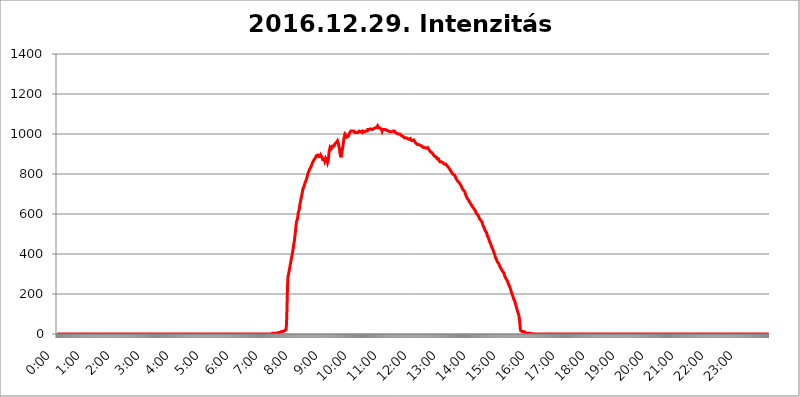
| Category | 2016.12.29. Intenzitás [W/m^2] |
|---|---|
| 0.0 | 0 |
| 0.0006944444444444445 | 0 |
| 0.001388888888888889 | 0 |
| 0.0020833333333333333 | 0 |
| 0.002777777777777778 | 0 |
| 0.003472222222222222 | 0 |
| 0.004166666666666667 | 0 |
| 0.004861111111111111 | 0 |
| 0.005555555555555556 | 0 |
| 0.0062499999999999995 | 0 |
| 0.006944444444444444 | 0 |
| 0.007638888888888889 | 0 |
| 0.008333333333333333 | 0 |
| 0.009027777777777779 | 0 |
| 0.009722222222222222 | 0 |
| 0.010416666666666666 | 0 |
| 0.011111111111111112 | 0 |
| 0.011805555555555555 | 0 |
| 0.012499999999999999 | 0 |
| 0.013194444444444444 | 0 |
| 0.013888888888888888 | 0 |
| 0.014583333333333332 | 0 |
| 0.015277777777777777 | 0 |
| 0.015972222222222224 | 0 |
| 0.016666666666666666 | 0 |
| 0.017361111111111112 | 0 |
| 0.018055555555555557 | 0 |
| 0.01875 | 0 |
| 0.019444444444444445 | 0 |
| 0.02013888888888889 | 0 |
| 0.020833333333333332 | 0 |
| 0.02152777777777778 | 0 |
| 0.022222222222222223 | 0 |
| 0.02291666666666667 | 0 |
| 0.02361111111111111 | 0 |
| 0.024305555555555556 | 0 |
| 0.024999999999999998 | 0 |
| 0.025694444444444447 | 0 |
| 0.02638888888888889 | 0 |
| 0.027083333333333334 | 0 |
| 0.027777777777777776 | 0 |
| 0.02847222222222222 | 0 |
| 0.029166666666666664 | 0 |
| 0.029861111111111113 | 0 |
| 0.030555555555555555 | 0 |
| 0.03125 | 0 |
| 0.03194444444444445 | 0 |
| 0.03263888888888889 | 0 |
| 0.03333333333333333 | 0 |
| 0.034027777777777775 | 0 |
| 0.034722222222222224 | 0 |
| 0.035416666666666666 | 0 |
| 0.036111111111111115 | 0 |
| 0.03680555555555556 | 0 |
| 0.0375 | 0 |
| 0.03819444444444444 | 0 |
| 0.03888888888888889 | 0 |
| 0.03958333333333333 | 0 |
| 0.04027777777777778 | 0 |
| 0.04097222222222222 | 0 |
| 0.041666666666666664 | 0 |
| 0.042361111111111106 | 0 |
| 0.04305555555555556 | 0 |
| 0.043750000000000004 | 0 |
| 0.044444444444444446 | 0 |
| 0.04513888888888889 | 0 |
| 0.04583333333333334 | 0 |
| 0.04652777777777778 | 0 |
| 0.04722222222222222 | 0 |
| 0.04791666666666666 | 0 |
| 0.04861111111111111 | 0 |
| 0.049305555555555554 | 0 |
| 0.049999999999999996 | 0 |
| 0.05069444444444445 | 0 |
| 0.051388888888888894 | 0 |
| 0.052083333333333336 | 0 |
| 0.05277777777777778 | 0 |
| 0.05347222222222222 | 0 |
| 0.05416666666666667 | 0 |
| 0.05486111111111111 | 0 |
| 0.05555555555555555 | 0 |
| 0.05625 | 0 |
| 0.05694444444444444 | 0 |
| 0.057638888888888885 | 0 |
| 0.05833333333333333 | 0 |
| 0.05902777777777778 | 0 |
| 0.059722222222222225 | 0 |
| 0.06041666666666667 | 0 |
| 0.061111111111111116 | 0 |
| 0.06180555555555556 | 0 |
| 0.0625 | 0 |
| 0.06319444444444444 | 0 |
| 0.06388888888888888 | 0 |
| 0.06458333333333334 | 0 |
| 0.06527777777777778 | 0 |
| 0.06597222222222222 | 0 |
| 0.06666666666666667 | 0 |
| 0.06736111111111111 | 0 |
| 0.06805555555555555 | 0 |
| 0.06874999999999999 | 0 |
| 0.06944444444444443 | 0 |
| 0.07013888888888889 | 0 |
| 0.07083333333333333 | 0 |
| 0.07152777777777779 | 0 |
| 0.07222222222222223 | 0 |
| 0.07291666666666667 | 0 |
| 0.07361111111111111 | 0 |
| 0.07430555555555556 | 0 |
| 0.075 | 0 |
| 0.07569444444444444 | 0 |
| 0.0763888888888889 | 0 |
| 0.07708333333333334 | 0 |
| 0.07777777777777778 | 0 |
| 0.07847222222222222 | 0 |
| 0.07916666666666666 | 0 |
| 0.0798611111111111 | 0 |
| 0.08055555555555556 | 0 |
| 0.08125 | 0 |
| 0.08194444444444444 | 0 |
| 0.08263888888888889 | 0 |
| 0.08333333333333333 | 0 |
| 0.08402777777777777 | 0 |
| 0.08472222222222221 | 0 |
| 0.08541666666666665 | 0 |
| 0.08611111111111112 | 0 |
| 0.08680555555555557 | 0 |
| 0.08750000000000001 | 0 |
| 0.08819444444444445 | 0 |
| 0.08888888888888889 | 0 |
| 0.08958333333333333 | 0 |
| 0.09027777777777778 | 0 |
| 0.09097222222222222 | 0 |
| 0.09166666666666667 | 0 |
| 0.09236111111111112 | 0 |
| 0.09305555555555556 | 0 |
| 0.09375 | 0 |
| 0.09444444444444444 | 0 |
| 0.09513888888888888 | 0 |
| 0.09583333333333333 | 0 |
| 0.09652777777777777 | 0 |
| 0.09722222222222222 | 0 |
| 0.09791666666666667 | 0 |
| 0.09861111111111111 | 0 |
| 0.09930555555555555 | 0 |
| 0.09999999999999999 | 0 |
| 0.10069444444444443 | 0 |
| 0.1013888888888889 | 0 |
| 0.10208333333333335 | 0 |
| 0.10277777777777779 | 0 |
| 0.10347222222222223 | 0 |
| 0.10416666666666667 | 0 |
| 0.10486111111111111 | 0 |
| 0.10555555555555556 | 0 |
| 0.10625 | 0 |
| 0.10694444444444444 | 0 |
| 0.1076388888888889 | 0 |
| 0.10833333333333334 | 0 |
| 0.10902777777777778 | 0 |
| 0.10972222222222222 | 0 |
| 0.1111111111111111 | 0 |
| 0.11180555555555556 | 0 |
| 0.11180555555555556 | 0 |
| 0.1125 | 0 |
| 0.11319444444444444 | 0 |
| 0.11388888888888889 | 0 |
| 0.11458333333333333 | 0 |
| 0.11527777777777777 | 0 |
| 0.11597222222222221 | 0 |
| 0.11666666666666665 | 0 |
| 0.1173611111111111 | 0 |
| 0.11805555555555557 | 0 |
| 0.11944444444444445 | 0 |
| 0.12013888888888889 | 0 |
| 0.12083333333333333 | 0 |
| 0.12152777777777778 | 0 |
| 0.12222222222222223 | 0 |
| 0.12291666666666667 | 0 |
| 0.12291666666666667 | 0 |
| 0.12361111111111112 | 0 |
| 0.12430555555555556 | 0 |
| 0.125 | 0 |
| 0.12569444444444444 | 0 |
| 0.12638888888888888 | 0 |
| 0.12708333333333333 | 0 |
| 0.16875 | 0 |
| 0.12847222222222224 | 0 |
| 0.12916666666666668 | 0 |
| 0.12986111111111112 | 0 |
| 0.13055555555555556 | 0 |
| 0.13125 | 0 |
| 0.13194444444444445 | 0 |
| 0.1326388888888889 | 0 |
| 0.13333333333333333 | 0 |
| 0.13402777777777777 | 0 |
| 0.13402777777777777 | 0 |
| 0.13472222222222222 | 0 |
| 0.13541666666666666 | 0 |
| 0.1361111111111111 | 0 |
| 0.13749999999999998 | 0 |
| 0.13819444444444443 | 0 |
| 0.1388888888888889 | 0 |
| 0.13958333333333334 | 0 |
| 0.14027777777777778 | 0 |
| 0.14097222222222222 | 0 |
| 0.14166666666666666 | 0 |
| 0.1423611111111111 | 0 |
| 0.14305555555555557 | 0 |
| 0.14375000000000002 | 0 |
| 0.14444444444444446 | 0 |
| 0.1451388888888889 | 0 |
| 0.1451388888888889 | 0 |
| 0.14652777777777778 | 0 |
| 0.14722222222222223 | 0 |
| 0.14791666666666667 | 0 |
| 0.1486111111111111 | 0 |
| 0.14930555555555555 | 0 |
| 0.15 | 0 |
| 0.15069444444444444 | 0 |
| 0.15138888888888888 | 0 |
| 0.15208333333333332 | 0 |
| 0.15277777777777776 | 0 |
| 0.15347222222222223 | 0 |
| 0.15416666666666667 | 0 |
| 0.15486111111111112 | 0 |
| 0.15555555555555556 | 0 |
| 0.15625 | 0 |
| 0.15694444444444444 | 0 |
| 0.15763888888888888 | 0 |
| 0.15833333333333333 | 0 |
| 0.15902777777777777 | 0 |
| 0.15972222222222224 | 0 |
| 0.16041666666666668 | 0 |
| 0.16111111111111112 | 0 |
| 0.16180555555555556 | 0 |
| 0.1625 | 0 |
| 0.16319444444444445 | 0 |
| 0.1638888888888889 | 0 |
| 0.16458333333333333 | 0 |
| 0.16527777777777777 | 0 |
| 0.16597222222222222 | 0 |
| 0.16666666666666666 | 0 |
| 0.1673611111111111 | 0 |
| 0.16805555555555554 | 0 |
| 0.16874999999999998 | 0 |
| 0.16944444444444443 | 0 |
| 0.17013888888888887 | 0 |
| 0.1708333333333333 | 0 |
| 0.17152777777777775 | 0 |
| 0.17222222222222225 | 0 |
| 0.1729166666666667 | 0 |
| 0.17361111111111113 | 0 |
| 0.17430555555555557 | 0 |
| 0.17500000000000002 | 0 |
| 0.17569444444444446 | 0 |
| 0.1763888888888889 | 0 |
| 0.17708333333333334 | 0 |
| 0.17777777777777778 | 0 |
| 0.17847222222222223 | 0 |
| 0.17916666666666667 | 0 |
| 0.1798611111111111 | 0 |
| 0.18055555555555555 | 0 |
| 0.18125 | 0 |
| 0.18194444444444444 | 0 |
| 0.1826388888888889 | 0 |
| 0.18333333333333335 | 0 |
| 0.1840277777777778 | 0 |
| 0.18472222222222223 | 0 |
| 0.18541666666666667 | 0 |
| 0.18611111111111112 | 0 |
| 0.18680555555555556 | 0 |
| 0.1875 | 0 |
| 0.18819444444444444 | 0 |
| 0.18888888888888888 | 0 |
| 0.18958333333333333 | 0 |
| 0.19027777777777777 | 0 |
| 0.1909722222222222 | 0 |
| 0.19166666666666665 | 0 |
| 0.19236111111111112 | 0 |
| 0.19305555555555554 | 0 |
| 0.19375 | 0 |
| 0.19444444444444445 | 0 |
| 0.1951388888888889 | 0 |
| 0.19583333333333333 | 0 |
| 0.19652777777777777 | 0 |
| 0.19722222222222222 | 0 |
| 0.19791666666666666 | 0 |
| 0.1986111111111111 | 0 |
| 0.19930555555555554 | 0 |
| 0.19999999999999998 | 0 |
| 0.20069444444444443 | 0 |
| 0.20138888888888887 | 0 |
| 0.2020833333333333 | 0 |
| 0.2027777777777778 | 0 |
| 0.2034722222222222 | 0 |
| 0.2041666666666667 | 0 |
| 0.20486111111111113 | 0 |
| 0.20555555555555557 | 0 |
| 0.20625000000000002 | 0 |
| 0.20694444444444446 | 0 |
| 0.2076388888888889 | 0 |
| 0.20833333333333334 | 0 |
| 0.20902777777777778 | 0 |
| 0.20972222222222223 | 0 |
| 0.21041666666666667 | 0 |
| 0.2111111111111111 | 0 |
| 0.21180555555555555 | 0 |
| 0.2125 | 0 |
| 0.21319444444444444 | 0 |
| 0.2138888888888889 | 0 |
| 0.21458333333333335 | 0 |
| 0.2152777777777778 | 0 |
| 0.21597222222222223 | 0 |
| 0.21666666666666667 | 0 |
| 0.21736111111111112 | 0 |
| 0.21805555555555556 | 0 |
| 0.21875 | 0 |
| 0.21944444444444444 | 0 |
| 0.22013888888888888 | 0 |
| 0.22083333333333333 | 0 |
| 0.22152777777777777 | 0 |
| 0.2222222222222222 | 0 |
| 0.22291666666666665 | 0 |
| 0.2236111111111111 | 0 |
| 0.22430555555555556 | 0 |
| 0.225 | 0 |
| 0.22569444444444445 | 0 |
| 0.2263888888888889 | 0 |
| 0.22708333333333333 | 0 |
| 0.22777777777777777 | 0 |
| 0.22847222222222222 | 0 |
| 0.22916666666666666 | 0 |
| 0.2298611111111111 | 0 |
| 0.23055555555555554 | 0 |
| 0.23124999999999998 | 0 |
| 0.23194444444444443 | 0 |
| 0.23263888888888887 | 0 |
| 0.2333333333333333 | 0 |
| 0.2340277777777778 | 0 |
| 0.2347222222222222 | 0 |
| 0.2354166666666667 | 0 |
| 0.23611111111111113 | 0 |
| 0.23680555555555557 | 0 |
| 0.23750000000000002 | 0 |
| 0.23819444444444446 | 0 |
| 0.2388888888888889 | 0 |
| 0.23958333333333334 | 0 |
| 0.24027777777777778 | 0 |
| 0.24097222222222223 | 0 |
| 0.24166666666666667 | 0 |
| 0.2423611111111111 | 0 |
| 0.24305555555555555 | 0 |
| 0.24375 | 0 |
| 0.24444444444444446 | 0 |
| 0.24513888888888888 | 0 |
| 0.24583333333333335 | 0 |
| 0.2465277777777778 | 0 |
| 0.24722222222222223 | 0 |
| 0.24791666666666667 | 0 |
| 0.24861111111111112 | 0 |
| 0.24930555555555556 | 0 |
| 0.25 | 0 |
| 0.25069444444444444 | 0 |
| 0.2513888888888889 | 0 |
| 0.2520833333333333 | 0 |
| 0.25277777777777777 | 0 |
| 0.2534722222222222 | 0 |
| 0.25416666666666665 | 0 |
| 0.2548611111111111 | 0 |
| 0.2555555555555556 | 0 |
| 0.25625000000000003 | 0 |
| 0.2569444444444445 | 0 |
| 0.2576388888888889 | 0 |
| 0.25833333333333336 | 0 |
| 0.2590277777777778 | 0 |
| 0.25972222222222224 | 0 |
| 0.2604166666666667 | 0 |
| 0.2611111111111111 | 0 |
| 0.26180555555555557 | 0 |
| 0.2625 | 0 |
| 0.26319444444444445 | 0 |
| 0.2638888888888889 | 0 |
| 0.26458333333333334 | 0 |
| 0.2652777777777778 | 0 |
| 0.2659722222222222 | 0 |
| 0.26666666666666666 | 0 |
| 0.2673611111111111 | 0 |
| 0.26805555555555555 | 0 |
| 0.26875 | 0 |
| 0.26944444444444443 | 0 |
| 0.2701388888888889 | 0 |
| 0.2708333333333333 | 0 |
| 0.27152777777777776 | 0 |
| 0.2722222222222222 | 0 |
| 0.27291666666666664 | 0 |
| 0.2736111111111111 | 0 |
| 0.2743055555555555 | 0 |
| 0.27499999999999997 | 0 |
| 0.27569444444444446 | 0 |
| 0.27638888888888885 | 0 |
| 0.27708333333333335 | 0 |
| 0.2777777777777778 | 0 |
| 0.27847222222222223 | 0 |
| 0.2791666666666667 | 0 |
| 0.2798611111111111 | 0 |
| 0.28055555555555556 | 0 |
| 0.28125 | 0 |
| 0.28194444444444444 | 0 |
| 0.2826388888888889 | 0 |
| 0.2833333333333333 | 0 |
| 0.28402777777777777 | 0 |
| 0.2847222222222222 | 0 |
| 0.28541666666666665 | 0 |
| 0.28611111111111115 | 0 |
| 0.28680555555555554 | 0 |
| 0.28750000000000003 | 0 |
| 0.2881944444444445 | 0 |
| 0.2888888888888889 | 0 |
| 0.28958333333333336 | 0 |
| 0.2902777777777778 | 0 |
| 0.29097222222222224 | 0 |
| 0.2916666666666667 | 0 |
| 0.2923611111111111 | 0 |
| 0.29305555555555557 | 0 |
| 0.29375 | 0 |
| 0.29444444444444445 | 0 |
| 0.2951388888888889 | 0 |
| 0.29583333333333334 | 0 |
| 0.2965277777777778 | 0 |
| 0.2972222222222222 | 0 |
| 0.29791666666666666 | 0 |
| 0.2986111111111111 | 0 |
| 0.29930555555555555 | 0 |
| 0.3 | 0 |
| 0.30069444444444443 | 0 |
| 0.3013888888888889 | 0 |
| 0.3020833333333333 | 3.525 |
| 0.30277777777777776 | 3.525 |
| 0.3034722222222222 | 3.525 |
| 0.30416666666666664 | 3.525 |
| 0.3048611111111111 | 3.525 |
| 0.3055555555555555 | 3.525 |
| 0.30624999999999997 | 3.525 |
| 0.3069444444444444 | 3.525 |
| 0.3076388888888889 | 3.525 |
| 0.30833333333333335 | 3.525 |
| 0.3090277777777778 | 3.525 |
| 0.30972222222222223 | 7.887 |
| 0.3104166666666667 | 7.887 |
| 0.3111111111111111 | 7.887 |
| 0.31180555555555556 | 7.887 |
| 0.3125 | 7.887 |
| 0.31319444444444444 | 7.887 |
| 0.3138888888888889 | 7.887 |
| 0.3145833333333333 | 12.257 |
| 0.31527777777777777 | 12.257 |
| 0.3159722222222222 | 12.257 |
| 0.31666666666666665 | 12.257 |
| 0.31736111111111115 | 12.257 |
| 0.31805555555555554 | 16.636 |
| 0.31875000000000003 | 16.636 |
| 0.3194444444444445 | 16.636 |
| 0.3201388888888889 | 21.024 |
| 0.32083333333333336 | 21.024 |
| 0.3215277777777778 | 47.511 |
| 0.32222222222222224 | 128.284 |
| 0.3229166666666667 | 233 |
| 0.3236111111111111 | 287.709 |
| 0.32430555555555557 | 296.808 |
| 0.325 | 310.44 |
| 0.32569444444444445 | 324.052 |
| 0.3263888888888889 | 337.639 |
| 0.32708333333333334 | 351.198 |
| 0.3277777777777778 | 364.728 |
| 0.3284722222222222 | 378.224 |
| 0.32916666666666666 | 391.685 |
| 0.3298611111111111 | 405.108 |
| 0.33055555555555555 | 418.492 |
| 0.33125 | 436.27 |
| 0.33194444444444443 | 453.968 |
| 0.3326388888888889 | 467.187 |
| 0.3333333333333333 | 489.108 |
| 0.3340277777777778 | 510.885 |
| 0.3347222222222222 | 536.82 |
| 0.3354166666666667 | 558.261 |
| 0.3361111111111111 | 562.53 |
| 0.3368055555555556 | 575.299 |
| 0.33749999999999997 | 588.009 |
| 0.33819444444444446 | 609.062 |
| 0.33888888888888885 | 617.436 |
| 0.33958333333333335 | 625.784 |
| 0.34027777777777773 | 646.537 |
| 0.34097222222222223 | 658.909 |
| 0.3416666666666666 | 671.22 |
| 0.3423611111111111 | 683.473 |
| 0.3430555555555555 | 695.666 |
| 0.34375 | 707.8 |
| 0.3444444444444445 | 723.889 |
| 0.3451388888888889 | 719.877 |
| 0.3458333333333334 | 735.89 |
| 0.34652777777777777 | 743.859 |
| 0.34722222222222227 | 747.834 |
| 0.34791666666666665 | 759.723 |
| 0.34861111111111115 | 763.674 |
| 0.34930555555555554 | 771.559 |
| 0.35000000000000003 | 779.42 |
| 0.3506944444444444 | 791.169 |
| 0.3513888888888889 | 798.974 |
| 0.3520833333333333 | 806.757 |
| 0.3527777777777778 | 810.641 |
| 0.3534722222222222 | 818.392 |
| 0.3541666666666667 | 826.123 |
| 0.3548611111111111 | 829.981 |
| 0.35555555555555557 | 833.834 |
| 0.35625 | 837.682 |
| 0.35694444444444445 | 845.365 |
| 0.3576388888888889 | 853.029 |
| 0.35833333333333334 | 856.855 |
| 0.3590277777777778 | 864.493 |
| 0.3597222222222222 | 868.305 |
| 0.36041666666666666 | 868.305 |
| 0.3611111111111111 | 875.918 |
| 0.36180555555555555 | 879.719 |
| 0.3625 | 883.516 |
| 0.36319444444444443 | 891.099 |
| 0.3638888888888889 | 894.885 |
| 0.3645833333333333 | 894.885 |
| 0.3652777777777778 | 894.885 |
| 0.3659722222222222 | 891.099 |
| 0.3666666666666667 | 887.309 |
| 0.3673611111111111 | 887.309 |
| 0.3680555555555556 | 887.309 |
| 0.36874999999999997 | 887.309 |
| 0.36944444444444446 | 894.885 |
| 0.37013888888888885 | 898.668 |
| 0.37083333333333335 | 898.668 |
| 0.37152777777777773 | 883.516 |
| 0.37222222222222223 | 872.114 |
| 0.3729166666666666 | 868.305 |
| 0.3736111111111111 | 872.114 |
| 0.3743055555555555 | 872.114 |
| 0.375 | 864.493 |
| 0.3756944444444445 | 868.305 |
| 0.3763888888888889 | 879.719 |
| 0.3770833333333334 | 883.516 |
| 0.37777777777777777 | 883.516 |
| 0.37847222222222227 | 868.305 |
| 0.37916666666666665 | 856.855 |
| 0.37986111111111115 | 864.493 |
| 0.38055555555555554 | 883.516 |
| 0.38125000000000003 | 909.996 |
| 0.3819444444444444 | 921.298 |
| 0.3826388888888889 | 932.576 |
| 0.3833333333333333 | 932.576 |
| 0.3840277777777778 | 925.06 |
| 0.3847222222222222 | 925.06 |
| 0.3854166666666667 | 932.576 |
| 0.3861111111111111 | 940.082 |
| 0.38680555555555557 | 940.082 |
| 0.3875 | 943.832 |
| 0.38819444444444445 | 940.082 |
| 0.3888888888888889 | 943.832 |
| 0.38958333333333334 | 951.327 |
| 0.3902777777777778 | 951.327 |
| 0.3909722222222222 | 955.071 |
| 0.39166666666666666 | 958.814 |
| 0.3923611111111111 | 962.555 |
| 0.39305555555555555 | 966.295 |
| 0.39375 | 966.295 |
| 0.39444444444444443 | 951.327 |
| 0.3951388888888889 | 936.33 |
| 0.3958333333333333 | 925.06 |
| 0.3965277777777778 | 902.447 |
| 0.3972222222222222 | 894.885 |
| 0.3979166666666667 | 883.516 |
| 0.3986111111111111 | 887.309 |
| 0.3993055555555556 | 909.996 |
| 0.39999999999999997 | 925.06 |
| 0.40069444444444446 | 940.082 |
| 0.40138888888888885 | 958.814 |
| 0.40208333333333335 | 977.508 |
| 0.40277777777777773 | 988.714 |
| 0.40347222222222223 | 999.916 |
| 0.4041666666666666 | 1003.65 |
| 0.4048611111111111 | 999.916 |
| 0.4055555555555555 | 992.448 |
| 0.40625 | 984.98 |
| 0.4069444444444445 | 984.98 |
| 0.4076388888888889 | 988.714 |
| 0.4083333333333334 | 988.714 |
| 0.40902777777777777 | 992.448 |
| 0.40972222222222227 | 1003.65 |
| 0.41041666666666665 | 1007.383 |
| 0.41111111111111115 | 1007.383 |
| 0.41180555555555554 | 1014.852 |
| 0.41250000000000003 | 1018.587 |
| 0.4131944444444444 | 1018.587 |
| 0.4138888888888889 | 1014.852 |
| 0.4145833333333333 | 1018.587 |
| 0.4152777777777778 | 1014.852 |
| 0.4159722222222222 | 1014.852 |
| 0.4166666666666667 | 1011.118 |
| 0.4173611111111111 | 1007.383 |
| 0.41805555555555557 | 1007.383 |
| 0.41875 | 1011.118 |
| 0.41944444444444445 | 1007.383 |
| 0.4201388888888889 | 1007.383 |
| 0.42083333333333334 | 1007.383 |
| 0.4215277777777778 | 1007.383 |
| 0.4222222222222222 | 1011.118 |
| 0.42291666666666666 | 1011.118 |
| 0.4236111111111111 | 1014.852 |
| 0.42430555555555555 | 1011.118 |
| 0.425 | 1014.852 |
| 0.42569444444444443 | 1011.118 |
| 0.4263888888888889 | 1011.118 |
| 0.4270833333333333 | 1007.383 |
| 0.4277777777777778 | 1007.383 |
| 0.4284722222222222 | 1014.852 |
| 0.4291666666666667 | 1014.852 |
| 0.4298611111111111 | 1011.118 |
| 0.4305555555555556 | 1011.118 |
| 0.43124999999999997 | 1014.852 |
| 0.43194444444444446 | 1014.852 |
| 0.43263888888888885 | 1014.852 |
| 0.43333333333333335 | 1014.852 |
| 0.43402777777777773 | 1014.852 |
| 0.43472222222222223 | 1014.852 |
| 0.4354166666666666 | 1022.323 |
| 0.4361111111111111 | 1026.06 |
| 0.4368055555555555 | 1022.323 |
| 0.4375 | 1022.323 |
| 0.4381944444444445 | 1022.323 |
| 0.4388888888888889 | 1026.06 |
| 0.4395833333333334 | 1026.06 |
| 0.44027777777777777 | 1022.323 |
| 0.44097222222222227 | 1022.323 |
| 0.44166666666666665 | 1022.323 |
| 0.44236111111111115 | 1022.323 |
| 0.44305555555555554 | 1026.06 |
| 0.44375000000000003 | 1026.06 |
| 0.4444444444444444 | 1029.798 |
| 0.4451388888888889 | 1026.06 |
| 0.4458333333333333 | 1029.798 |
| 0.4465277777777778 | 1029.798 |
| 0.4472222222222222 | 1029.798 |
| 0.4479166666666667 | 1033.537 |
| 0.4486111111111111 | 1033.537 |
| 0.44930555555555557 | 1041.019 |
| 0.45 | 1037.277 |
| 0.45069444444444445 | 1029.798 |
| 0.4513888888888889 | 1026.06 |
| 0.45208333333333334 | 1029.798 |
| 0.4527777777777778 | 1029.798 |
| 0.4534722222222222 | 1026.06 |
| 0.45416666666666666 | 1026.06 |
| 0.4548611111111111 | 1022.323 |
| 0.45555555555555555 | 1014.852 |
| 0.45625 | 1022.323 |
| 0.45694444444444443 | 1022.323 |
| 0.4576388888888889 | 1018.587 |
| 0.4583333333333333 | 1022.323 |
| 0.4590277777777778 | 1018.587 |
| 0.4597222222222222 | 1022.323 |
| 0.4604166666666667 | 1022.323 |
| 0.4611111111111111 | 1018.587 |
| 0.4618055555555556 | 1018.587 |
| 0.46249999999999997 | 1018.587 |
| 0.46319444444444446 | 1022.323 |
| 0.46388888888888885 | 1018.587 |
| 0.46458333333333335 | 1014.852 |
| 0.46527777777777773 | 1018.587 |
| 0.46597222222222223 | 1014.852 |
| 0.4666666666666666 | 1011.118 |
| 0.4673611111111111 | 1011.118 |
| 0.4680555555555555 | 1014.852 |
| 0.46875 | 1011.118 |
| 0.4694444444444445 | 1011.118 |
| 0.4701388888888889 | 1014.852 |
| 0.4708333333333334 | 1014.852 |
| 0.47152777777777777 | 1014.852 |
| 0.47222222222222227 | 1014.852 |
| 0.47291666666666665 | 1014.852 |
| 0.47361111111111115 | 1011.118 |
| 0.47430555555555554 | 1007.383 |
| 0.47500000000000003 | 1007.383 |
| 0.4756944444444444 | 1007.383 |
| 0.4763888888888889 | 1003.65 |
| 0.4770833333333333 | 999.916 |
| 0.4777777777777778 | 999.916 |
| 0.4784722222222222 | 999.916 |
| 0.4791666666666667 | 996.182 |
| 0.4798611111111111 | 999.916 |
| 0.48055555555555557 | 999.916 |
| 0.48125 | 999.916 |
| 0.48194444444444445 | 996.182 |
| 0.4826388888888889 | 992.448 |
| 0.48333333333333334 | 992.448 |
| 0.4840277777777778 | 992.448 |
| 0.4847222222222222 | 988.714 |
| 0.48541666666666666 | 984.98 |
| 0.4861111111111111 | 984.98 |
| 0.48680555555555555 | 981.244 |
| 0.4875 | 984.98 |
| 0.48819444444444443 | 984.98 |
| 0.4888888888888889 | 981.244 |
| 0.4895833333333333 | 981.244 |
| 0.4902777777777778 | 977.508 |
| 0.4909722222222222 | 977.508 |
| 0.4916666666666667 | 977.508 |
| 0.4923611111111111 | 977.508 |
| 0.4930555555555556 | 973.772 |
| 0.49374999999999997 | 970.034 |
| 0.49444444444444446 | 973.772 |
| 0.49513888888888885 | 977.508 |
| 0.49583333333333335 | 970.034 |
| 0.49652777777777773 | 966.295 |
| 0.49722222222222223 | 966.295 |
| 0.4979166666666666 | 966.295 |
| 0.4986111111111111 | 966.295 |
| 0.4993055555555555 | 966.295 |
| 0.5 | 970.034 |
| 0.5006944444444444 | 966.295 |
| 0.5013888888888889 | 962.555 |
| 0.5020833333333333 | 962.555 |
| 0.5027777777777778 | 955.071 |
| 0.5034722222222222 | 955.071 |
| 0.5041666666666667 | 951.327 |
| 0.5048611111111111 | 947.58 |
| 0.5055555555555555 | 951.327 |
| 0.50625 | 951.327 |
| 0.5069444444444444 | 947.58 |
| 0.5076388888888889 | 947.58 |
| 0.5083333333333333 | 947.58 |
| 0.5090277777777777 | 943.832 |
| 0.5097222222222222 | 940.082 |
| 0.5104166666666666 | 943.832 |
| 0.5111111111111112 | 940.082 |
| 0.5118055555555555 | 940.082 |
| 0.5125000000000001 | 936.33 |
| 0.5131944444444444 | 932.576 |
| 0.513888888888889 | 936.33 |
| 0.5145833333333333 | 936.33 |
| 0.5152777777777778 | 932.576 |
| 0.5159722222222222 | 932.576 |
| 0.5166666666666667 | 932.576 |
| 0.517361111111111 | 928.819 |
| 0.5180555555555556 | 932.576 |
| 0.5187499999999999 | 932.576 |
| 0.5194444444444445 | 932.576 |
| 0.5201388888888888 | 928.819 |
| 0.5208333333333334 | 925.06 |
| 0.5215277777777778 | 921.298 |
| 0.5222222222222223 | 917.534 |
| 0.5229166666666667 | 913.766 |
| 0.5236111111111111 | 909.996 |
| 0.5243055555555556 | 909.996 |
| 0.525 | 909.996 |
| 0.5256944444444445 | 906.223 |
| 0.5263888888888889 | 906.223 |
| 0.5270833333333333 | 902.447 |
| 0.5277777777777778 | 894.885 |
| 0.5284722222222222 | 894.885 |
| 0.5291666666666667 | 891.099 |
| 0.5298611111111111 | 887.309 |
| 0.5305555555555556 | 883.516 |
| 0.53125 | 883.516 |
| 0.5319444444444444 | 883.516 |
| 0.5326388888888889 | 875.918 |
| 0.5333333333333333 | 872.114 |
| 0.5340277777777778 | 872.114 |
| 0.5347222222222222 | 875.918 |
| 0.5354166666666667 | 868.305 |
| 0.5361111111111111 | 864.493 |
| 0.5368055555555555 | 860.676 |
| 0.5375 | 860.676 |
| 0.5381944444444444 | 860.676 |
| 0.5388888888888889 | 860.676 |
| 0.5395833333333333 | 860.676 |
| 0.5402777777777777 | 856.855 |
| 0.5409722222222222 | 856.855 |
| 0.5416666666666666 | 856.855 |
| 0.5423611111111112 | 853.029 |
| 0.5430555555555555 | 849.199 |
| 0.5437500000000001 | 845.365 |
| 0.5444444444444444 | 845.365 |
| 0.545138888888889 | 849.199 |
| 0.5458333333333333 | 845.365 |
| 0.5465277777777778 | 841.526 |
| 0.5472222222222222 | 837.682 |
| 0.5479166666666667 | 837.682 |
| 0.548611111111111 | 833.834 |
| 0.5493055555555556 | 829.981 |
| 0.5499999999999999 | 826.123 |
| 0.5506944444444445 | 822.26 |
| 0.5513888888888888 | 818.392 |
| 0.5520833333333334 | 814.519 |
| 0.5527777777777778 | 810.641 |
| 0.5534722222222223 | 810.641 |
| 0.5541666666666667 | 806.757 |
| 0.5548611111111111 | 798.974 |
| 0.5555555555555556 | 798.974 |
| 0.55625 | 798.974 |
| 0.5569444444444445 | 795.074 |
| 0.5576388888888889 | 791.169 |
| 0.5583333333333333 | 787.258 |
| 0.5590277777777778 | 779.42 |
| 0.5597222222222222 | 775.492 |
| 0.5604166666666667 | 771.559 |
| 0.5611111111111111 | 767.62 |
| 0.5618055555555556 | 763.674 |
| 0.5625 | 759.723 |
| 0.5631944444444444 | 759.723 |
| 0.5638888888888889 | 755.766 |
| 0.5645833333333333 | 751.803 |
| 0.5652777777777778 | 747.834 |
| 0.5659722222222222 | 743.859 |
| 0.5666666666666667 | 739.877 |
| 0.5673611111111111 | 735.89 |
| 0.5680555555555555 | 727.896 |
| 0.56875 | 723.889 |
| 0.5694444444444444 | 719.877 |
| 0.5701388888888889 | 719.877 |
| 0.5708333333333333 | 715.858 |
| 0.5715277777777777 | 711.832 |
| 0.5722222222222222 | 703.762 |
| 0.5729166666666666 | 695.666 |
| 0.5736111111111112 | 691.608 |
| 0.5743055555555555 | 683.473 |
| 0.5750000000000001 | 679.395 |
| 0.5756944444444444 | 675.311 |
| 0.576388888888889 | 671.22 |
| 0.5770833333333333 | 667.123 |
| 0.5777777777777778 | 663.019 |
| 0.5784722222222222 | 658.909 |
| 0.5791666666666667 | 654.791 |
| 0.579861111111111 | 650.667 |
| 0.5805555555555556 | 650.667 |
| 0.5812499999999999 | 642.4 |
| 0.5819444444444445 | 642.4 |
| 0.5826388888888888 | 634.105 |
| 0.5833333333333334 | 634.105 |
| 0.5840277777777778 | 629.948 |
| 0.5847222222222223 | 625.784 |
| 0.5854166666666667 | 621.613 |
| 0.5861111111111111 | 617.436 |
| 0.5868055555555556 | 613.252 |
| 0.5875 | 604.864 |
| 0.5881944444444445 | 604.864 |
| 0.5888888888888889 | 600.661 |
| 0.5895833333333333 | 596.45 |
| 0.5902777777777778 | 592.233 |
| 0.5909722222222222 | 588.009 |
| 0.5916666666666667 | 583.779 |
| 0.5923611111111111 | 575.299 |
| 0.5930555555555556 | 575.299 |
| 0.59375 | 571.049 |
| 0.5944444444444444 | 566.793 |
| 0.5951388888888889 | 562.53 |
| 0.5958333333333333 | 558.261 |
| 0.5965277777777778 | 549.704 |
| 0.5972222222222222 | 541.121 |
| 0.5979166666666667 | 536.82 |
| 0.5986111111111111 | 532.513 |
| 0.5993055555555555 | 523.88 |
| 0.6 | 519.555 |
| 0.6006944444444444 | 515.223 |
| 0.6013888888888889 | 515.223 |
| 0.6020833333333333 | 506.542 |
| 0.6027777777777777 | 497.836 |
| 0.6034722222222222 | 489.108 |
| 0.6041666666666666 | 484.735 |
| 0.6048611111111112 | 480.356 |
| 0.6055555555555555 | 471.582 |
| 0.6062500000000001 | 462.786 |
| 0.6069444444444444 | 458.38 |
| 0.607638888888889 | 453.968 |
| 0.6083333333333333 | 445.129 |
| 0.6090277777777778 | 440.702 |
| 0.6097222222222222 | 431.833 |
| 0.6104166666666667 | 427.39 |
| 0.611111111111111 | 422.943 |
| 0.6118055555555556 | 414.035 |
| 0.6124999999999999 | 409.574 |
| 0.6131944444444445 | 400.638 |
| 0.6138888888888888 | 391.685 |
| 0.6145833333333334 | 382.715 |
| 0.6152777777777778 | 378.224 |
| 0.6159722222222223 | 373.729 |
| 0.6166666666666667 | 369.23 |
| 0.6173611111111111 | 360.221 |
| 0.6180555555555556 | 355.712 |
| 0.61875 | 355.712 |
| 0.6194444444444445 | 351.198 |
| 0.6201388888888889 | 342.162 |
| 0.6208333333333333 | 337.639 |
| 0.6215277777777778 | 333.113 |
| 0.6222222222222222 | 328.584 |
| 0.6229166666666667 | 324.052 |
| 0.6236111111111111 | 319.517 |
| 0.6243055555555556 | 314.98 |
| 0.625 | 310.44 |
| 0.6256944444444444 | 310.44 |
| 0.6263888888888889 | 305.898 |
| 0.6270833333333333 | 296.808 |
| 0.6277777777777778 | 287.709 |
| 0.6284722222222222 | 283.156 |
| 0.6291666666666667 | 278.603 |
| 0.6298611111111111 | 278.603 |
| 0.6305555555555555 | 269.49 |
| 0.63125 | 264.932 |
| 0.6319444444444444 | 260.373 |
| 0.6326388888888889 | 251.251 |
| 0.6333333333333333 | 246.689 |
| 0.6340277777777777 | 242.127 |
| 0.6347222222222222 | 237.564 |
| 0.6354166666666666 | 228.436 |
| 0.6361111111111112 | 219.309 |
| 0.6368055555555555 | 210.182 |
| 0.6375000000000001 | 205.62 |
| 0.6381944444444444 | 196.497 |
| 0.638888888888889 | 191.937 |
| 0.6395833333333333 | 182.82 |
| 0.6402777777777778 | 173.709 |
| 0.6409722222222222 | 169.156 |
| 0.6416666666666667 | 164.605 |
| 0.642361111111111 | 155.509 |
| 0.6430555555555556 | 146.423 |
| 0.6437499999999999 | 137.347 |
| 0.6444444444444445 | 128.284 |
| 0.6451388888888888 | 119.235 |
| 0.6458333333333334 | 110.201 |
| 0.6465277777777778 | 105.69 |
| 0.6472222222222223 | 96.682 |
| 0.6479166666666667 | 83.205 |
| 0.6486111111111111 | 60.85 |
| 0.6493055555555556 | 29.823 |
| 0.65 | 16.636 |
| 0.6506944444444445 | 16.636 |
| 0.6513888888888889 | 12.257 |
| 0.6520833333333333 | 12.257 |
| 0.6527777777777778 | 12.257 |
| 0.6534722222222222 | 12.257 |
| 0.6541666666666667 | 12.257 |
| 0.6548611111111111 | 12.257 |
| 0.6555555555555556 | 7.887 |
| 0.65625 | 7.887 |
| 0.6569444444444444 | 7.887 |
| 0.6576388888888889 | 7.887 |
| 0.6583333333333333 | 3.525 |
| 0.6590277777777778 | 3.525 |
| 0.6597222222222222 | 3.525 |
| 0.6604166666666667 | 3.525 |
| 0.6611111111111111 | 3.525 |
| 0.6618055555555555 | 3.525 |
| 0.6625 | 3.525 |
| 0.6631944444444444 | 3.525 |
| 0.6638888888888889 | 3.525 |
| 0.6645833333333333 | 3.525 |
| 0.6652777777777777 | 0 |
| 0.6659722222222222 | 0 |
| 0.6666666666666666 | 0 |
| 0.6673611111111111 | 0 |
| 0.6680555555555556 | 0 |
| 0.6687500000000001 | 0 |
| 0.6694444444444444 | 0 |
| 0.6701388888888888 | 0 |
| 0.6708333333333334 | 0 |
| 0.6715277777777778 | 0 |
| 0.6722222222222222 | 0 |
| 0.6729166666666666 | 0 |
| 0.6736111111111112 | 0 |
| 0.6743055555555556 | 0 |
| 0.6749999999999999 | 0 |
| 0.6756944444444444 | 0 |
| 0.6763888888888889 | 0 |
| 0.6770833333333334 | 0 |
| 0.6777777777777777 | 0 |
| 0.6784722222222223 | 0 |
| 0.6791666666666667 | 0 |
| 0.6798611111111111 | 0 |
| 0.6805555555555555 | 0 |
| 0.68125 | 0 |
| 0.6819444444444445 | 0 |
| 0.6826388888888889 | 0 |
| 0.6833333333333332 | 0 |
| 0.6840277777777778 | 0 |
| 0.6847222222222222 | 0 |
| 0.6854166666666667 | 0 |
| 0.686111111111111 | 0 |
| 0.6868055555555556 | 0 |
| 0.6875 | 0 |
| 0.6881944444444444 | 0 |
| 0.688888888888889 | 0 |
| 0.6895833333333333 | 0 |
| 0.6902777777777778 | 0 |
| 0.6909722222222222 | 0 |
| 0.6916666666666668 | 0 |
| 0.6923611111111111 | 0 |
| 0.6930555555555555 | 0 |
| 0.69375 | 0 |
| 0.6944444444444445 | 0 |
| 0.6951388888888889 | 0 |
| 0.6958333333333333 | 0 |
| 0.6965277777777777 | 0 |
| 0.6972222222222223 | 0 |
| 0.6979166666666666 | 0 |
| 0.6986111111111111 | 0 |
| 0.6993055555555556 | 0 |
| 0.7000000000000001 | 0 |
| 0.7006944444444444 | 0 |
| 0.7013888888888888 | 0 |
| 0.7020833333333334 | 0 |
| 0.7027777777777778 | 0 |
| 0.7034722222222222 | 0 |
| 0.7041666666666666 | 0 |
| 0.7048611111111112 | 0 |
| 0.7055555555555556 | 0 |
| 0.7062499999999999 | 0 |
| 0.7069444444444444 | 0 |
| 0.7076388888888889 | 0 |
| 0.7083333333333334 | 0 |
| 0.7090277777777777 | 0 |
| 0.7097222222222223 | 0 |
| 0.7104166666666667 | 0 |
| 0.7111111111111111 | 0 |
| 0.7118055555555555 | 0 |
| 0.7125 | 0 |
| 0.7131944444444445 | 0 |
| 0.7138888888888889 | 0 |
| 0.7145833333333332 | 0 |
| 0.7152777777777778 | 0 |
| 0.7159722222222222 | 0 |
| 0.7166666666666667 | 0 |
| 0.717361111111111 | 0 |
| 0.7180555555555556 | 0 |
| 0.71875 | 0 |
| 0.7194444444444444 | 0 |
| 0.720138888888889 | 0 |
| 0.7208333333333333 | 0 |
| 0.7215277777777778 | 0 |
| 0.7222222222222222 | 0 |
| 0.7229166666666668 | 0 |
| 0.7236111111111111 | 0 |
| 0.7243055555555555 | 0 |
| 0.725 | 0 |
| 0.7256944444444445 | 0 |
| 0.7263888888888889 | 0 |
| 0.7270833333333333 | 0 |
| 0.7277777777777777 | 0 |
| 0.7284722222222223 | 0 |
| 0.7291666666666666 | 0 |
| 0.7298611111111111 | 0 |
| 0.7305555555555556 | 0 |
| 0.7312500000000001 | 0 |
| 0.7319444444444444 | 0 |
| 0.7326388888888888 | 0 |
| 0.7333333333333334 | 0 |
| 0.7340277777777778 | 0 |
| 0.7347222222222222 | 0 |
| 0.7354166666666666 | 0 |
| 0.7361111111111112 | 0 |
| 0.7368055555555556 | 0 |
| 0.7374999999999999 | 0 |
| 0.7381944444444444 | 0 |
| 0.7388888888888889 | 0 |
| 0.7395833333333334 | 0 |
| 0.7402777777777777 | 0 |
| 0.7409722222222223 | 0 |
| 0.7416666666666667 | 0 |
| 0.7423611111111111 | 0 |
| 0.7430555555555555 | 0 |
| 0.74375 | 0 |
| 0.7444444444444445 | 0 |
| 0.7451388888888889 | 0 |
| 0.7458333333333332 | 0 |
| 0.7465277777777778 | 0 |
| 0.7472222222222222 | 0 |
| 0.7479166666666667 | 0 |
| 0.748611111111111 | 0 |
| 0.7493055555555556 | 0 |
| 0.75 | 0 |
| 0.7506944444444444 | 0 |
| 0.751388888888889 | 0 |
| 0.7520833333333333 | 0 |
| 0.7527777777777778 | 0 |
| 0.7534722222222222 | 0 |
| 0.7541666666666668 | 0 |
| 0.7548611111111111 | 0 |
| 0.7555555555555555 | 0 |
| 0.75625 | 0 |
| 0.7569444444444445 | 0 |
| 0.7576388888888889 | 0 |
| 0.7583333333333333 | 0 |
| 0.7590277777777777 | 0 |
| 0.7597222222222223 | 0 |
| 0.7604166666666666 | 0 |
| 0.7611111111111111 | 0 |
| 0.7618055555555556 | 0 |
| 0.7625000000000001 | 0 |
| 0.7631944444444444 | 0 |
| 0.7638888888888888 | 0 |
| 0.7645833333333334 | 0 |
| 0.7652777777777778 | 0 |
| 0.7659722222222222 | 0 |
| 0.7666666666666666 | 0 |
| 0.7673611111111112 | 0 |
| 0.7680555555555556 | 0 |
| 0.7687499999999999 | 0 |
| 0.7694444444444444 | 0 |
| 0.7701388888888889 | 0 |
| 0.7708333333333334 | 0 |
| 0.7715277777777777 | 0 |
| 0.7722222222222223 | 0 |
| 0.7729166666666667 | 0 |
| 0.7736111111111111 | 0 |
| 0.7743055555555555 | 0 |
| 0.775 | 0 |
| 0.7756944444444445 | 0 |
| 0.7763888888888889 | 0 |
| 0.7770833333333332 | 0 |
| 0.7777777777777778 | 0 |
| 0.7784722222222222 | 0 |
| 0.7791666666666667 | 0 |
| 0.779861111111111 | 0 |
| 0.7805555555555556 | 0 |
| 0.78125 | 0 |
| 0.7819444444444444 | 0 |
| 0.782638888888889 | 0 |
| 0.7833333333333333 | 0 |
| 0.7840277777777778 | 0 |
| 0.7847222222222222 | 0 |
| 0.7854166666666668 | 0 |
| 0.7861111111111111 | 0 |
| 0.7868055555555555 | 0 |
| 0.7875 | 0 |
| 0.7881944444444445 | 0 |
| 0.7888888888888889 | 0 |
| 0.7895833333333333 | 0 |
| 0.7902777777777777 | 0 |
| 0.7909722222222223 | 0 |
| 0.7916666666666666 | 0 |
| 0.7923611111111111 | 0 |
| 0.7930555555555556 | 0 |
| 0.7937500000000001 | 0 |
| 0.7944444444444444 | 0 |
| 0.7951388888888888 | 0 |
| 0.7958333333333334 | 0 |
| 0.7965277777777778 | 0 |
| 0.7972222222222222 | 0 |
| 0.7979166666666666 | 0 |
| 0.7986111111111112 | 0 |
| 0.7993055555555556 | 0 |
| 0.7999999999999999 | 0 |
| 0.8006944444444444 | 0 |
| 0.8013888888888889 | 0 |
| 0.8020833333333334 | 0 |
| 0.8027777777777777 | 0 |
| 0.8034722222222223 | 0 |
| 0.8041666666666667 | 0 |
| 0.8048611111111111 | 0 |
| 0.8055555555555555 | 0 |
| 0.80625 | 0 |
| 0.8069444444444445 | 0 |
| 0.8076388888888889 | 0 |
| 0.8083333333333332 | 0 |
| 0.8090277777777778 | 0 |
| 0.8097222222222222 | 0 |
| 0.8104166666666667 | 0 |
| 0.811111111111111 | 0 |
| 0.8118055555555556 | 0 |
| 0.8125 | 0 |
| 0.8131944444444444 | 0 |
| 0.813888888888889 | 0 |
| 0.8145833333333333 | 0 |
| 0.8152777777777778 | 0 |
| 0.8159722222222222 | 0 |
| 0.8166666666666668 | 0 |
| 0.8173611111111111 | 0 |
| 0.8180555555555555 | 0 |
| 0.81875 | 0 |
| 0.8194444444444445 | 0 |
| 0.8201388888888889 | 0 |
| 0.8208333333333333 | 0 |
| 0.8215277777777777 | 0 |
| 0.8222222222222223 | 0 |
| 0.8229166666666666 | 0 |
| 0.8236111111111111 | 0 |
| 0.8243055555555556 | 0 |
| 0.8250000000000001 | 0 |
| 0.8256944444444444 | 0 |
| 0.8263888888888888 | 0 |
| 0.8270833333333334 | 0 |
| 0.8277777777777778 | 0 |
| 0.8284722222222222 | 0 |
| 0.8291666666666666 | 0 |
| 0.8298611111111112 | 0 |
| 0.8305555555555556 | 0 |
| 0.8312499999999999 | 0 |
| 0.8319444444444444 | 0 |
| 0.8326388888888889 | 0 |
| 0.8333333333333334 | 0 |
| 0.8340277777777777 | 0 |
| 0.8347222222222223 | 0 |
| 0.8354166666666667 | 0 |
| 0.8361111111111111 | 0 |
| 0.8368055555555555 | 0 |
| 0.8375 | 0 |
| 0.8381944444444445 | 0 |
| 0.8388888888888889 | 0 |
| 0.8395833333333332 | 0 |
| 0.8402777777777778 | 0 |
| 0.8409722222222222 | 0 |
| 0.8416666666666667 | 0 |
| 0.842361111111111 | 0 |
| 0.8430555555555556 | 0 |
| 0.84375 | 0 |
| 0.8444444444444444 | 0 |
| 0.845138888888889 | 0 |
| 0.8458333333333333 | 0 |
| 0.8465277777777778 | 0 |
| 0.8472222222222222 | 0 |
| 0.8479166666666668 | 0 |
| 0.8486111111111111 | 0 |
| 0.8493055555555555 | 0 |
| 0.85 | 0 |
| 0.8506944444444445 | 0 |
| 0.8513888888888889 | 0 |
| 0.8520833333333333 | 0 |
| 0.8527777777777777 | 0 |
| 0.8534722222222223 | 0 |
| 0.8541666666666666 | 0 |
| 0.8548611111111111 | 0 |
| 0.8555555555555556 | 0 |
| 0.8562500000000001 | 0 |
| 0.8569444444444444 | 0 |
| 0.8576388888888888 | 0 |
| 0.8583333333333334 | 0 |
| 0.8590277777777778 | 0 |
| 0.8597222222222222 | 0 |
| 0.8604166666666666 | 0 |
| 0.8611111111111112 | 0 |
| 0.8618055555555556 | 0 |
| 0.8624999999999999 | 0 |
| 0.8631944444444444 | 0 |
| 0.8638888888888889 | 0 |
| 0.8645833333333334 | 0 |
| 0.8652777777777777 | 0 |
| 0.8659722222222223 | 0 |
| 0.8666666666666667 | 0 |
| 0.8673611111111111 | 0 |
| 0.8680555555555555 | 0 |
| 0.86875 | 0 |
| 0.8694444444444445 | 0 |
| 0.8701388888888889 | 0 |
| 0.8708333333333332 | 0 |
| 0.8715277777777778 | 0 |
| 0.8722222222222222 | 0 |
| 0.8729166666666667 | 0 |
| 0.873611111111111 | 0 |
| 0.8743055555555556 | 0 |
| 0.875 | 0 |
| 0.8756944444444444 | 0 |
| 0.876388888888889 | 0 |
| 0.8770833333333333 | 0 |
| 0.8777777777777778 | 0 |
| 0.8784722222222222 | 0 |
| 0.8791666666666668 | 0 |
| 0.8798611111111111 | 0 |
| 0.8805555555555555 | 0 |
| 0.88125 | 0 |
| 0.8819444444444445 | 0 |
| 0.8826388888888889 | 0 |
| 0.8833333333333333 | 0 |
| 0.8840277777777777 | 0 |
| 0.8847222222222223 | 0 |
| 0.8854166666666666 | 0 |
| 0.8861111111111111 | 0 |
| 0.8868055555555556 | 0 |
| 0.8875000000000001 | 0 |
| 0.8881944444444444 | 0 |
| 0.8888888888888888 | 0 |
| 0.8895833333333334 | 0 |
| 0.8902777777777778 | 0 |
| 0.8909722222222222 | 0 |
| 0.8916666666666666 | 0 |
| 0.8923611111111112 | 0 |
| 0.8930555555555556 | 0 |
| 0.8937499999999999 | 0 |
| 0.8944444444444444 | 0 |
| 0.8951388888888889 | 0 |
| 0.8958333333333334 | 0 |
| 0.8965277777777777 | 0 |
| 0.8972222222222223 | 0 |
| 0.8979166666666667 | 0 |
| 0.8986111111111111 | 0 |
| 0.8993055555555555 | 0 |
| 0.9 | 0 |
| 0.9006944444444445 | 0 |
| 0.9013888888888889 | 0 |
| 0.9020833333333332 | 0 |
| 0.9027777777777778 | 0 |
| 0.9034722222222222 | 0 |
| 0.9041666666666667 | 0 |
| 0.904861111111111 | 0 |
| 0.9055555555555556 | 0 |
| 0.90625 | 0 |
| 0.9069444444444444 | 0 |
| 0.907638888888889 | 0 |
| 0.9083333333333333 | 0 |
| 0.9090277777777778 | 0 |
| 0.9097222222222222 | 0 |
| 0.9104166666666668 | 0 |
| 0.9111111111111111 | 0 |
| 0.9118055555555555 | 0 |
| 0.9125 | 0 |
| 0.9131944444444445 | 0 |
| 0.9138888888888889 | 0 |
| 0.9145833333333333 | 0 |
| 0.9152777777777777 | 0 |
| 0.9159722222222223 | 0 |
| 0.9166666666666666 | 0 |
| 0.9173611111111111 | 0 |
| 0.9180555555555556 | 0 |
| 0.9187500000000001 | 0 |
| 0.9194444444444444 | 0 |
| 0.9201388888888888 | 0 |
| 0.9208333333333334 | 0 |
| 0.9215277777777778 | 0 |
| 0.9222222222222222 | 0 |
| 0.9229166666666666 | 0 |
| 0.9236111111111112 | 0 |
| 0.9243055555555556 | 0 |
| 0.9249999999999999 | 0 |
| 0.9256944444444444 | 0 |
| 0.9263888888888889 | 0 |
| 0.9270833333333334 | 0 |
| 0.9277777777777777 | 0 |
| 0.9284722222222223 | 0 |
| 0.9291666666666667 | 0 |
| 0.9298611111111111 | 0 |
| 0.9305555555555555 | 0 |
| 0.93125 | 0 |
| 0.9319444444444445 | 0 |
| 0.9326388888888889 | 0 |
| 0.9333333333333332 | 0 |
| 0.9340277777777778 | 0 |
| 0.9347222222222222 | 0 |
| 0.9354166666666667 | 0 |
| 0.936111111111111 | 0 |
| 0.9368055555555556 | 0 |
| 0.9375 | 0 |
| 0.9381944444444444 | 0 |
| 0.938888888888889 | 0 |
| 0.9395833333333333 | 0 |
| 0.9402777777777778 | 0 |
| 0.9409722222222222 | 0 |
| 0.9416666666666668 | 0 |
| 0.9423611111111111 | 0 |
| 0.9430555555555555 | 0 |
| 0.94375 | 0 |
| 0.9444444444444445 | 0 |
| 0.9451388888888889 | 0 |
| 0.9458333333333333 | 0 |
| 0.9465277777777777 | 0 |
| 0.9472222222222223 | 0 |
| 0.9479166666666666 | 0 |
| 0.9486111111111111 | 0 |
| 0.9493055555555556 | 0 |
| 0.9500000000000001 | 0 |
| 0.9506944444444444 | 0 |
| 0.9513888888888888 | 0 |
| 0.9520833333333334 | 0 |
| 0.9527777777777778 | 0 |
| 0.9534722222222222 | 0 |
| 0.9541666666666666 | 0 |
| 0.9548611111111112 | 0 |
| 0.9555555555555556 | 0 |
| 0.9562499999999999 | 0 |
| 0.9569444444444444 | 0 |
| 0.9576388888888889 | 0 |
| 0.9583333333333334 | 0 |
| 0.9590277777777777 | 0 |
| 0.9597222222222223 | 0 |
| 0.9604166666666667 | 0 |
| 0.9611111111111111 | 0 |
| 0.9618055555555555 | 0 |
| 0.9625 | 0 |
| 0.9631944444444445 | 0 |
| 0.9638888888888889 | 0 |
| 0.9645833333333332 | 0 |
| 0.9652777777777778 | 0 |
| 0.9659722222222222 | 0 |
| 0.9666666666666667 | 0 |
| 0.967361111111111 | 0 |
| 0.9680555555555556 | 0 |
| 0.96875 | 0 |
| 0.9694444444444444 | 0 |
| 0.970138888888889 | 0 |
| 0.9708333333333333 | 0 |
| 0.9715277777777778 | 0 |
| 0.9722222222222222 | 0 |
| 0.9729166666666668 | 0 |
| 0.9736111111111111 | 0 |
| 0.9743055555555555 | 0 |
| 0.975 | 0 |
| 0.9756944444444445 | 0 |
| 0.9763888888888889 | 0 |
| 0.9770833333333333 | 0 |
| 0.9777777777777777 | 0 |
| 0.9784722222222223 | 0 |
| 0.9791666666666666 | 0 |
| 0.9798611111111111 | 0 |
| 0.9805555555555556 | 0 |
| 0.9812500000000001 | 0 |
| 0.9819444444444444 | 0 |
| 0.9826388888888888 | 0 |
| 0.9833333333333334 | 0 |
| 0.9840277777777778 | 0 |
| 0.9847222222222222 | 0 |
| 0.9854166666666666 | 0 |
| 0.9861111111111112 | 0 |
| 0.9868055555555556 | 0 |
| 0.9874999999999999 | 0 |
| 0.9881944444444444 | 0 |
| 0.9888888888888889 | 0 |
| 0.9895833333333334 | 0 |
| 0.9902777777777777 | 0 |
| 0.9909722222222223 | 0 |
| 0.9916666666666667 | 0 |
| 0.9923611111111111 | 0 |
| 0.9930555555555555 | 0 |
| 0.99375 | 0 |
| 0.9944444444444445 | 0 |
| 0.9951388888888889 | 0 |
| 0.9958333333333332 | 0 |
| 0.9965277777777778 | 0 |
| 0.9972222222222222 | 0 |
| 0.9979166666666667 | 0 |
| 0.998611111111111 | 0 |
| 0.9993055555555556 | 0 |